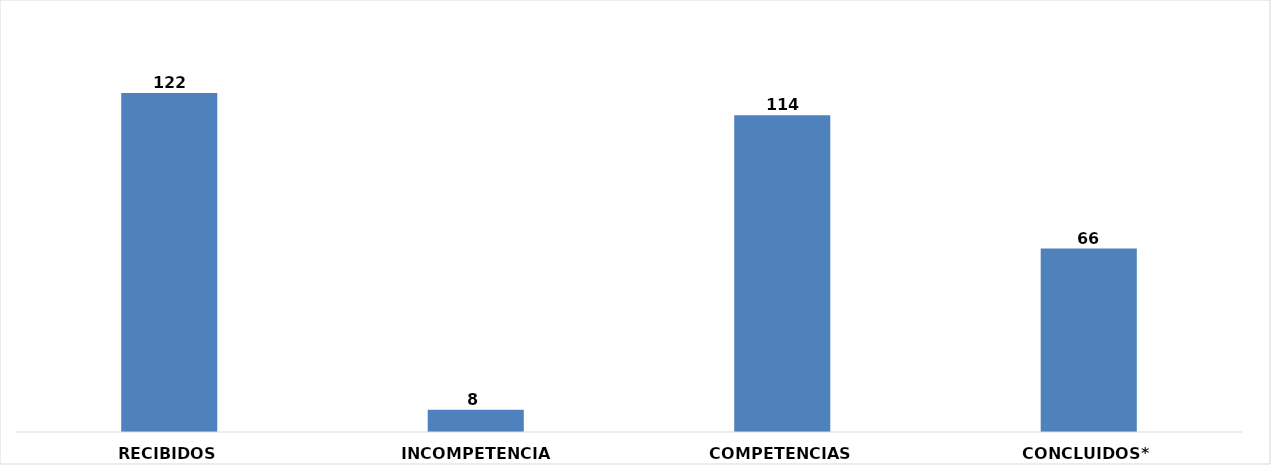
| Category | CANTIDAD |
|---|---|
| RECIBIDOS | 122 |
| INCOMPETENCIAS | 8 |
| COMPETENCIAS | 114 |
| CONCLUIDOS* | 66 |